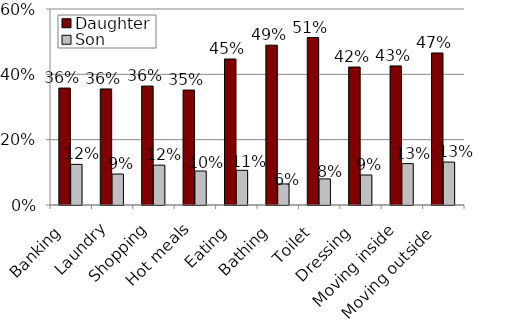
| Category | Daughter | Son  |
|---|---|---|
| Banking  | 0.358 | 0.124 |
| Laundry | 0.355 | 0.095 |
| Shopping | 0.364 | 0.122 |
| Hot meals | 0.352 | 0.104 |
| Eating  | 0.447 | 0.106 |
| Bathing  | 0.489 | 0.065 |
| Toilet  | 0.513 | 0.08 |
| Dressing  | 0.422 | 0.092 |
| Moving inside | 0.426 | 0.127 |
| Moving outside  | 0.465 | 0.131 |